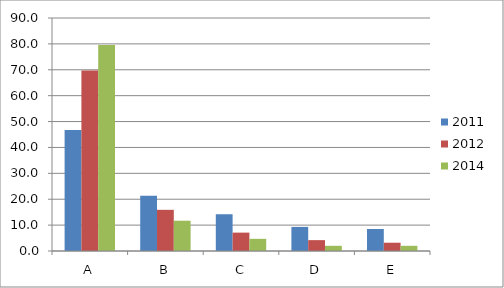
| Category | 2011 | 2012 | 2014 |
|---|---|---|---|
| A | 46.7 | 69.7 | 79.6 |
| B | 21.3 | 15.9 | 11.7 |
| C | 14.2 | 7.1 | 4.7 |
| D | 9.3 | 4.2 | 2 |
| E | 8.5 | 3.2 | 2 |